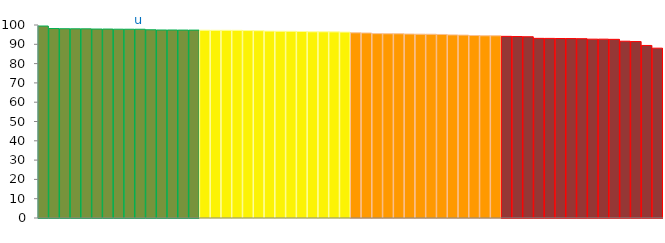
| Category | Top Quartile | 2nd Quartile | 3rd Quartile | Bottom Quartile | Series 4 |
|---|---|---|---|---|---|
|  | 99.47 | 0 | 0 | 0 | 99.47 |
|  | 98.17 | 0 | 0 | 0 | 98.17 |
|  | 98.07 | 0 | 0 | 0 | 98.07 |
|  | 98.03 | 0 | 0 | 0 | 98.03 |
|  | 98.01 | 0 | 0 | 0 | 98.01 |
|  | 97.91 | 0 | 0 | 0 | 97.91 |
|  | 97.9 | 0 | 0 | 0 | 97.9 |
|  | 97.83 | 0 | 0 | 0 | 97.83 |
|  | 97.81 | 0 | 0 | 0 | 97.81 |
| u | 97.8 | 0 | 0 | 0 | 97.8 |